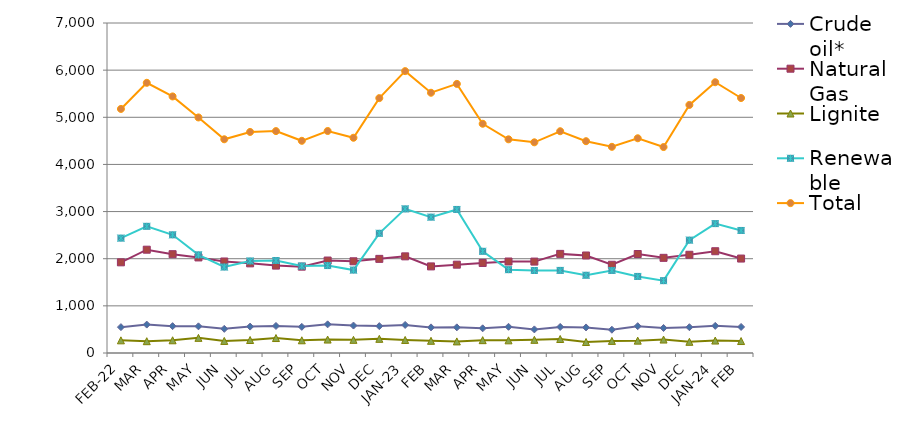
| Category | Crude oil* | Natural Gas | Lignite | Renewable | Total |
|---|---|---|---|---|---|
| FEB-22 | 548.709 | 1923.055 | 268.76 | 2436.84 | 5177.364 |
| MAR | 602.636 | 2191.149 | 250.556 | 2686.93 | 5731.271 |
| APR | 569.613 | 2095.9 | 269.716 | 2506.9 | 5442.129 |
| MAY | 566.052 | 2027.253 | 321.338 | 2081.93 | 4996.573 |
| JUN | 512.473 | 1941.278 | 255.9 | 1823.9 | 4533.551 |
| JUL | 559.849 | 1901.744 | 275.488 | 1951.93 | 4689.012 |
| AUG | 573.58 | 1854.011 | 317.401 | 1961.93 | 4706.923 |
| SEP | 554.735 | 1831.648 | 269.711 | 1844.9 | 4500.994 |
| OCT | 607.579 | 1961.43 | 285.05 | 1854.93 | 4708.989 |
| NOV | 582.233 | 1945.369 | 279.099 | 1758.9 | 4565.601 |
| DEC | 570.234 | 1996.901 | 300.462 | 2538.93 | 5406.527 |
| JAN-23 | 595.562 | 2050.073 | 276.483 | 3056.93 | 5979.047 |
| FEB | 543.347 | 1836.922 | 258.545 | 2881.84 | 5520.654 |
| MAR | 544.138 | 1873.48 | 245.758 | 3044.93 | 5708.305 |
| APR | 523.544 | 1909.944 | 272.275 | 2156.9 | 4862.664 |
| MAY | 555.528 | 1940.819 | 268.537 | 1767.92 | 4532.804 |
| JUN | 500.728 | 1939.074 | 279.286 | 1749.89 | 4468.978 |
| JUL | 552.562 | 2102.521 | 297.24 | 1751.82 | 4704.143 |
| AUG | 541.98 | 2068.423 | 233.345 | 1649 | 4492.748 |
| SEP | 493.796 | 1871.622 | 257.035 | 1751 | 4373.453 |
| OCT | 568.929 | 2099.825 | 262.217 | 1624 | 4554.971 |
| NOV | 530.557 | 2018.486 | 285.229 | 1534.74 | 4369.011 |
| DEC | 547.269 | 2083.579 | 237.306 | 2393.76 | 5261.914 |
| JAN-24 | 575.65 | 2158.954 | 263.844 | 2744.93 | 5743.377 |
| FEB | 552.581 | 2003.299 | 253.773 | 2599.17 | 5408.823 |